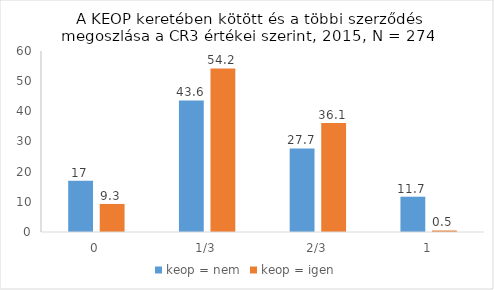
| Category | keop = nem | keop = igen |
|---|---|---|
| 0 | 17 | 9.3 |
| 1/3 | 43.6 | 54.2 |
| 2/3 | 27.7 | 36.1 |
| 1 | 11.7 | 0.5 |